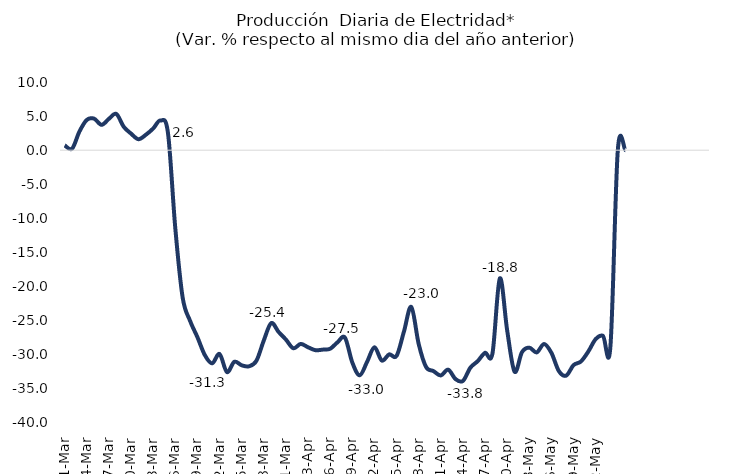
| Category | Series 0 |
|---|---|
| 1-Mar | 0.709 |
| 2-Mar | 0.218 |
| 3-Mar | 2.741 |
| 4-Mar | 4.446 |
| 5-Mar | 4.621 |
| 6-Mar | 3.716 |
| 7-Mar | 4.606 |
| 8-Mar | 5.319 |
| 9-Mar | 3.443 |
| 10-Mar | 2.433 |
| 11-Mar | 1.612 |
| 12-Mar | 2.261 |
| 13-Mar | 3.183 |
| 14-Mar | 4.36 |
| 15-Mar | 2.568 |
| 16-Mar | -11.467 |
| 17-Mar | -21.636 |
| 18-Mar | -25.018 |
| 19-Mar | -27.42 |
| 20-Mar | -30.037 |
| 21-Mar | -31.256 |
| 22-Mar | -29.885 |
| 23-Mar | -32.533 |
| 24-Mar | -31.023 |
| 25-Mar | -31.536 |
| 26-Mar | -31.683 |
| 27-Mar | -30.87 |
| 28-Mar | -27.893 |
| 29-Mar | -25.354 |
| 30-Mar | -26.643 |
| 31-Mar | -27.771 |
| 1-Apr | -29.041 |
| 2-Apr | -28.405 |
| 3-Apr | -28.896 |
| 4-Apr | -29.323 |
| 5-Apr | -29.241 |
| 6-Apr | -29.112 |
| 7-Apr | -28.16 |
| 8-Apr | -27.487 |
| 9-Apr | -31.128 |
| 10-Apr | -33.005 |
| 11-Apr | -31.044 |
| 12-Apr | -28.891 |
| 13-Apr | -30.846 |
| 14-Apr | -29.94 |
| 15-Apr | -30.156 |
| 16-Apr | -26.6 |
| 17-Apr | -22.987 |
| 18-Apr | -28.413 |
| 19-Apr | -31.785 |
| 20-Apr | -32.385 |
| 21-Apr | -33.031 |
| 22-Apr | -32.177 |
| 23-Apr | -33.569 |
| 24-Apr | -33.831 |
| 25-Apr | -31.899 |
| 26-Apr | -30.933 |
| 27-Apr | -29.712 |
| 28-Apr | -29.836 |
| 29-Apr | -18.801 |
| 30-Apr | -26.445 |
| 1-May | -32.467 |
| 2-May | -29.619 |
| 3-May | -28.949 |
| 4-May | -29.651 |
| 5-May | -28.418 |
| 6-May | -29.722 |
| 7-May | -32.37 |
| 8-May | -33.052 |
| 9-May | -31.507 |
| 10-May | -30.979 |
| 11-May | -29.519 |
| 12-May | -27.698 |
| 13-May | -27.223 |
| 14-May | -28.719 |